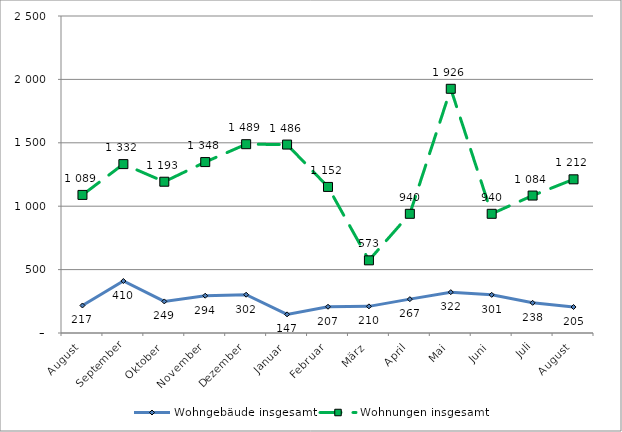
| Category | Wohngebäude insgesamt | Wohnungen insgesamt |
|---|---|---|
| August | 217 | 1089 |
| September | 410 | 1332 |
| Oktober | 249 | 1193 |
| November | 294 | 1348 |
| Dezember | 302 | 1489 |
| Januar | 147 | 1486 |
| Februar | 207 | 1152 |
| März | 210 | 573 |
| April | 267 | 940 |
| Mai | 322 | 1926 |
| Juni | 301 | 940 |
| Juli | 238 | 1084 |
| August | 205 | 1212 |